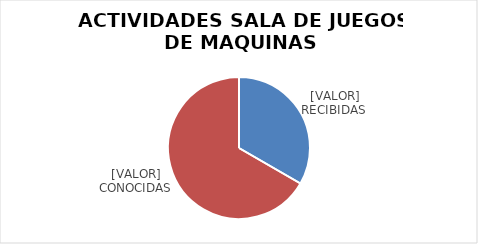
| Category | Series 0 |
|---|---|
| 0 | 1 |
| 1 | 2 |